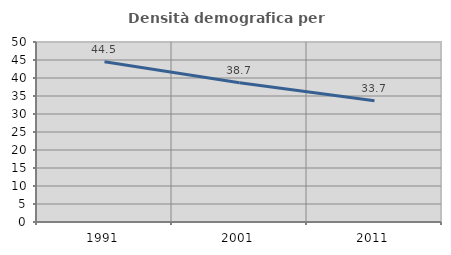
| Category | Densità demografica |
|---|---|
| 1991.0 | 44.538 |
| 2001.0 | 38.683 |
| 2011.0 | 33.687 |